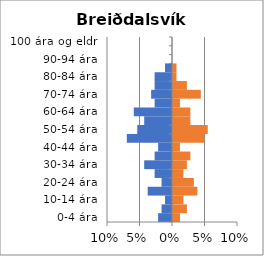
| Category | % karlar | %konur |
|---|---|---|
| 0-4 ára | -0.021 | 0.011 |
| 5-9 ára | -0.016 | 0.021 |
| 10-14 ára | -0.011 | 0.016 |
| 15-19 ára | -0.037 | 0.037 |
| 20-24 ára | -0.016 | 0.032 |
| 25-29 ára | -0.027 | 0.016 |
| 30-34 ára | -0.043 | 0.021 |
| 35-39 ára | -0.027 | 0.027 |
| 40-44 ára | -0.021 | 0.011 |
| 45-49 ára | -0.07 | 0.048 |
| 50-54 ára | -0.053 | 0.053 |
| 55-59 ára | -0.043 | 0.027 |
| 60-64 ára | -0.059 | 0.027 |
| 65-69 ára | -0.027 | 0.011 |
| 70-74 ára | -0.032 | 0.043 |
| 75-79 ára | -0.027 | 0.021 |
| 80-84 ára | -0.027 | 0.005 |
| 85-89 ára | -0.011 | 0.005 |
| 90-94 ára | 0 | 0 |
| 95-99 ára | 0 | 0 |
| 100 ára og eldri | 0 | 0 |